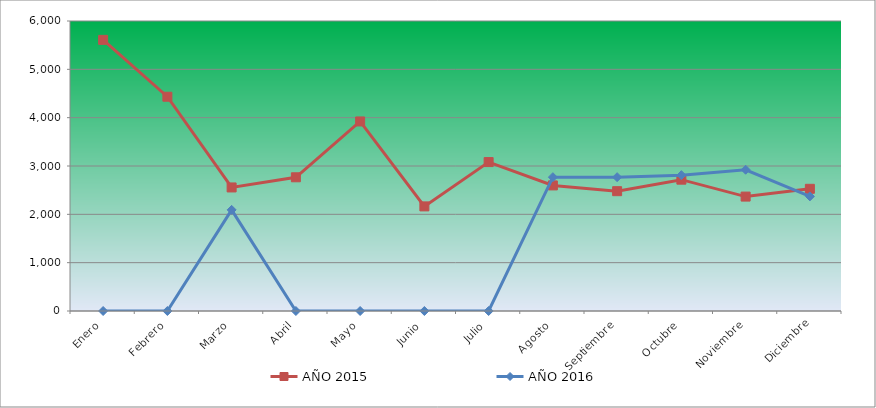
| Category | AÑO 2015 | AÑO 2016 |
|---|---|---|
| Enero | 5609.644 | 0 |
| Febrero | 4433.089 | 0 |
| Marzo | 2556.205 | 2092.509 |
| Abril | 2766.304 | 0 |
| Mayo | 3921.848 | 0 |
| Junio | 2164.02 | 0 |
| Julio | 3081.452 | 0 |
| Agosto | 2598.224 | 2769.087 |
| Septiembre | 2479.168 | 2769.087 |
| Octubre | 2717.281 | 2810.937 |
| Noviembre | 2367.116 | 2922.537 |
| Diciembre | 2528.191 | 2371.51 |